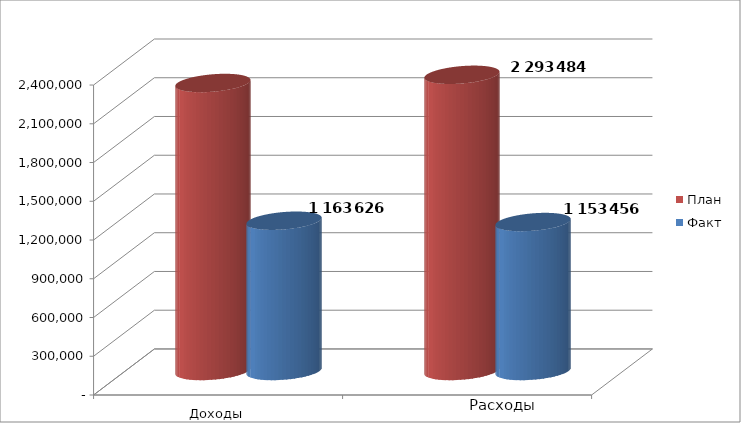
| Category | План | Факт |
|---|---|---|
| 0 | 2230109 | 1163626 |
| 1 | 2293484 | 1153456 |